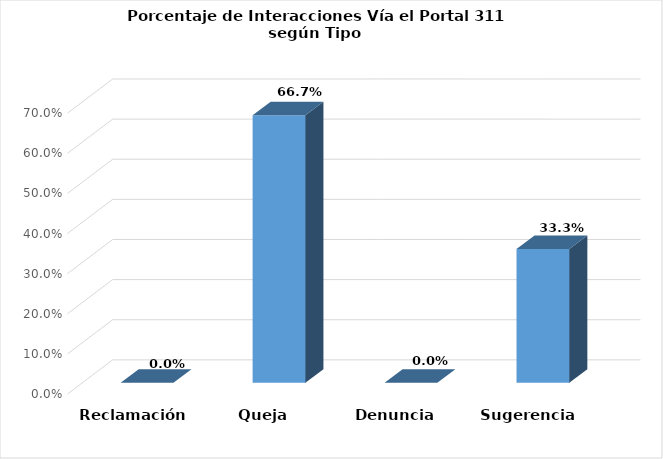
| Category | Series 0 |
|---|---|
| Reclamación | 0 |
| Queja | 0.667 |
| Denuncia | 0 |
| Sugerencia | 0.333 |